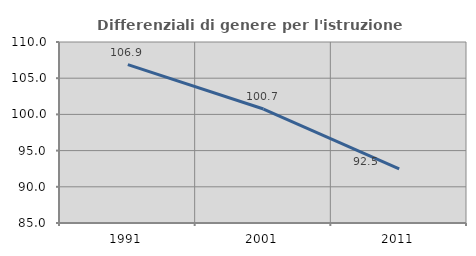
| Category | Differenziali di genere per l'istruzione superiore |
|---|---|
| 1991.0 | 106.877 |
| 2001.0 | 100.745 |
| 2011.0 | 92.463 |